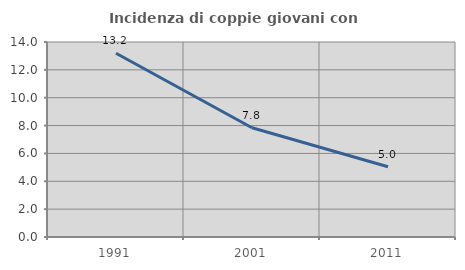
| Category | Incidenza di coppie giovani con figli |
|---|---|
| 1991.0 | 13.194 |
| 2001.0 | 7.844 |
| 2011.0 | 5.043 |